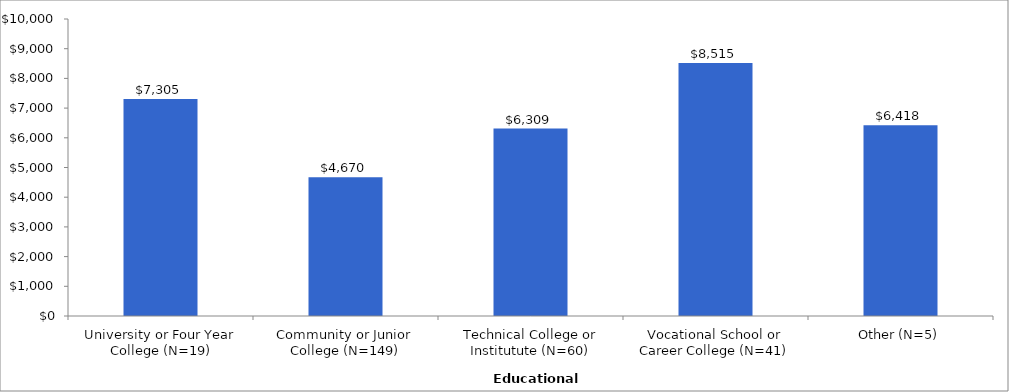
| Category | Series 0 |
|---|---|
| University or Four Year College (N=19) | 7305.21 |
| Community or Junior College (N=149) | 4669.57 |
| Technical College or Institutute (N=60) | 6308.98 |
| Vocational School or Career College (N=41) | 8515 |
| Other (N=5) | 6418.4 |